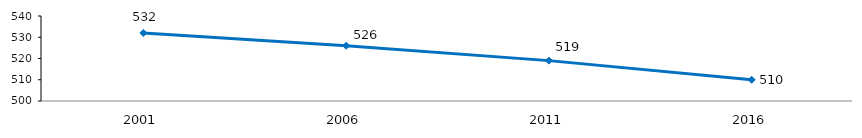
| Category | Textes informatifs |
|---|---|
| 2001.0 | 532 |
| 2006.0 | 526 |
| 2011.0 | 519 |
| 2016.0 | 510 |